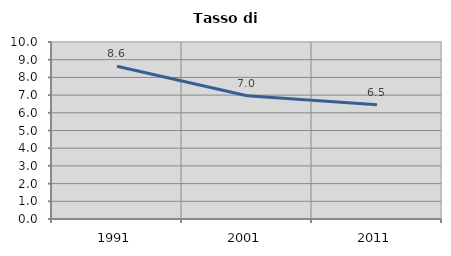
| Category | Tasso di disoccupazione   |
|---|---|
| 1991.0 | 8.633 |
| 2001.0 | 6.962 |
| 2011.0 | 6.452 |